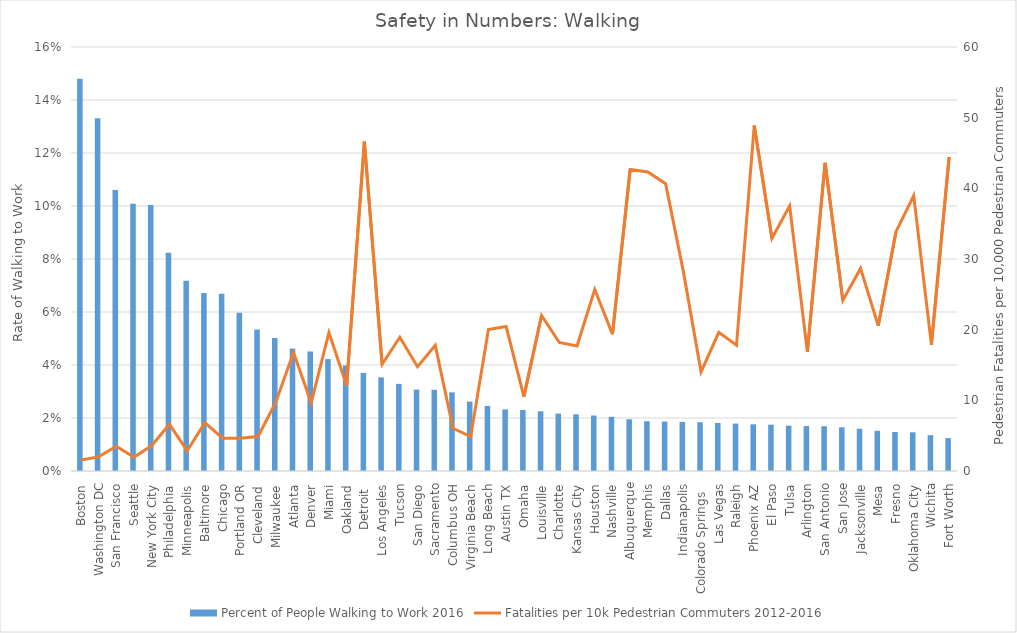
| Category | Percent of People Walking to Work 2016 |
|---|---|
| Boston | 0.148 |
| Washington DC | 0.133 |
| San Francisco | 0.106 |
| Seattle | 0.101 |
| New York City | 0.1 |
| Philadelphia | 0.082 |
| Minneapolis | 0.072 |
| Baltimore | 0.067 |
| Chicago | 0.067 |
| Portland OR | 0.06 |
| Cleveland | 0.053 |
| Milwaukee | 0.05 |
| Atlanta | 0.046 |
| Denver | 0.045 |
| Miami | 0.042 |
| Oakland | 0.04 |
| Detroit  | 0.037 |
| Los Angeles | 0.035 |
| Tucson | 0.033 |
| San Diego | 0.031 |
| Sacramento | 0.031 |
| Columbus OH | 0.03 |
| Virginia Beach | 0.026 |
| Long Beach | 0.025 |
| Austin TX | 0.023 |
| Omaha | 0.023 |
| Louisville | 0.023 |
| Charlotte | 0.022 |
| Kansas City | 0.021 |
| Houston | 0.021 |
| Nashville | 0.02 |
| Albuquerque | 0.02 |
| Memphis | 0.019 |
| Dallas | 0.019 |
| Indianapolis | 0.019 |
| Colorado Springs   | 0.018 |
| Las Vegas | 0.018 |
| Raleigh | 0.018 |
| Phoenix AZ | 0.018 |
| El Paso | 0.017 |
| Tulsa | 0.017 |
| Arlington | 0.017 |
| San Antonio | 0.017 |
| San Jose | 0.017 |
| Jacksonville | 0.016 |
| Mesa | 0.015 |
| Fresno | 0.015 |
| Oklahoma City | 0.015 |
| Wichita | 0.014 |
| Fort Worth | 0.012 |